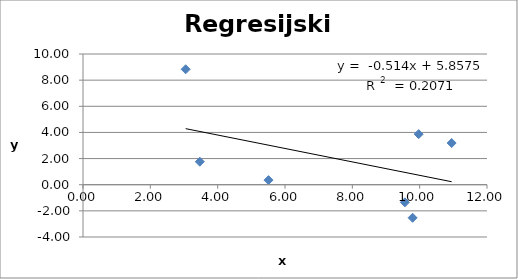
| Category | Series 0 |
|---|---|
| 3.05 | 8.83 |
| 3.47 | 1.76 |
| 5.51 | 0.35 |
| 9.56 | -1.35 |
| 9.79 | -2.53 |
| 9.97 | 3.87 |
| 10.95 | 3.19 |